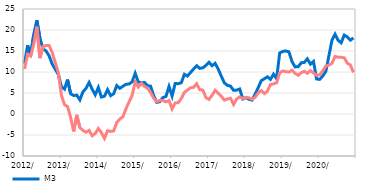
| Category | M3  | Домаћи кредити немонетарном сектору |
|---|---|---|
| 2012-01-01 | 12.01 | 10.729 |
| 2012-02-01 | 16.354 | 14.221 |
| 2012-03-01 | 13.992 | 13.782 |
| 2012-04-01 | 18.952 | 16.69 |
| 2012-05-01 | 22.329 | 20.823 |
| 2012-06-01 | 18.134 | 13.296 |
| 2012-07-01 | 15.507 | 16.043 |
| 2012-08-01 | 15.015 | 16.313 |
| 2012-09-01 | 13.837 | 16.292 |
| 2012-10-01 | 11.912 | 14.641 |
| 2012-11-01 | 10.629 | 12.241 |
| 2012-12-01 | 9.421 | 9.834 |
| 2013-01-01 | 6.554 | 4.448 |
| 2013-02-01 | 5.916 | 2.211 |
| 2013-03-01 | 8.196 | 1.791 |
| 2013-04-01 | 4.809 | -0.816 |
| 2013-05-01 | 4.39 | -4.149 |
| 2013-06-01 | 4.482 | -0.203 |
| 2013-07-01 | 3.358 | -3.232 |
| 2013-08-01 | 5.277 | -3.913 |
| 2013-09-01 | 6.108 | -4.338 |
| 2013-10-01 | 7.502 | -3.897 |
| 2013-11-01 | 5.896 | -5.181 |
| 2013-12-01 | 4.573 | -4.65 |
| 2014-01-01 | 6.313 | -3.453 |
| 2014-02-01 | 4.038 | -4.43 |
| 2014-03-01 | 4.234 | -5.804 |
| 2014-04-01 | 5.797 | -3.993 |
| 2014-05-01 | 4.358 | -4.149 |
| 2014-06-01 | 4.845 | -4.035 |
| 2014-07-01 | 6.767 | -2.016 |
| 2014-08-01 | 6.108 | -1.198 |
| 2014-09-01 | 6.605 | -0.64 |
| 2014-10-01 | 7.075 | 1.254 |
| 2014-11-01 | 7.143 | 2.874 |
| 2014-12-01 | 7.648 | 4.423 |
| 2015-01-01 | 9.694 | 7.684 |
| 2015-02-01 | 7.639 | 6.418 |
| 2015-03-01 | 7.404 | 7.278 |
| 2015-04-01 | 7.508 | 6.557 |
| 2015-05-01 | 6.749 | 6.196 |
| 2015-06-01 | 6.629 | 5.14 |
| 2015-07-01 | 4.381 | 3.777 |
| 2015-08-01 | 2.769 | 2.955 |
| 2015-09-01 | 2.936 | 3.226 |
| 2015-10-01 | 3.902 | 3.199 |
| 2015-11-01 | 4.175 | 2.893 |
| 2015-12-01 | 6.564 | 3.196 |
| 2016-01-01 | 4.278 | 1.199 |
| 2016-02-01 | 7.267 | 2.638 |
| 2016-03-01 | 7.218 | 2.687 |
| 2016-04-01 | 7.458 | 3.711 |
| 2016-05-01 | 9.45 | 5.171 |
| 2016-06-01 | 9.03 | 5.69 |
| 2016-07-01 | 9.881 | 6.257 |
| 2016-08-01 | 10.715 | 6.355 |
| 2016-09-01 | 11.496 | 7.196 |
| 2016-10-01 | 10.853 | 5.785 |
| 2016-11-01 | 11.002 | 5.691 |
| 2016-12-01 | 11.553 | 3.906 |
| 2017-01-01 | 12.319 | 3.474 |
| 2017-02-01 | 11.489 | 4.47 |
| 2017-03-01 | 12.067 | 5.654 |
| 2017-04-01 | 10.696 | 4.923 |
| 2017-05-01 | 9.013 | 4.221 |
| 2017-06-01 | 7.423 | 3.312 |
| 2017-07-01 | 6.807 | 3.565 |
| 2017-08-01 | 6.642 | 3.755 |
| 2017-09-01 | 5.632 | 2.278 |
| 2017-10-01 | 5.691 | 3.574 |
| 2017-11-01 | 5.952 | 4.092 |
| 2017-12-01 | 3.567 | 3.671 |
| 2018-01-01 | 3.888 | 3.977 |
| 2018-02-01 | 3.511 | 3.859 |
| 2018-03-01 | 3.318 | 3.502 |
| 2018-04-01 | 4.689 | 3.953 |
| 2018-05-01 | 6.249 | 5.016 |
| 2018-06-01 | 7.929 | 5.586 |
| 2018-07-01 | 8.383 | 4.847 |
| 2018-08-01 | 8.861 | 5.412 |
| 2018-09-01 | 8.24 | 7.016 |
| 2018-10-31 | 9.483 | 7.163 |
| 2018-11-30 | 8.409 | 7.417 |
| 2018-12-31 | 14.522 | 9.795 |
| 2019-01-31 | 14.909 | 10.252 |
| 2019-02-28 | 15.018 | 10.086 |
| 2019-03-31 | 14.797 | 9.982 |
| 2019-04-30 | 12.506 | 10.444 |
| 2019-05-31 | 11.216 | 9.694 |
| 2019-06-30 | 11.23 | 9.224 |
| 2019-07-31 | 12.186 | 9.826 |
| 2019-08-31 | 12.279 | 10.177 |
| 2019-09-30 | 13.127 | 9.697 |
| 2019-10-31 | 11.864 | 10.311 |
| 2019-11-30 | 12.513 | 9.755 |
| 2019-12-31 | 8.354 | 9.245 |
| 2020-01-31 | 8.237 | 9.334 |
| 2020-02-29 | 9.035 | 10.229 |
| 2020-03-31 | 10.113 | 11.424 |
| 2020-04-30 | 13.811 | 11.641 |
| 2020-05-31 | 17.557 | 12.071 |
| 2020-06-30 | 18.995 | 13.679 |
| 2020-07-31 | 17.552 | 13.526 |
| 2020-08-31 | 16.965 | 13.505 |
| 2020-09-30 | 18.779 | 13.379 |
| 2020-10-31 | 18.356 | 12.108 |
| 2020-11-30 | 17.578 | 11.663 |
| 2020-12-31 | 18.104 | 9.901 |